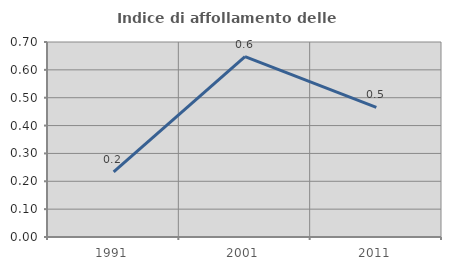
| Category | Indice di affollamento delle abitazioni  |
|---|---|
| 1991.0 | 0.234 |
| 2001.0 | 0.647 |
| 2011.0 | 0.465 |